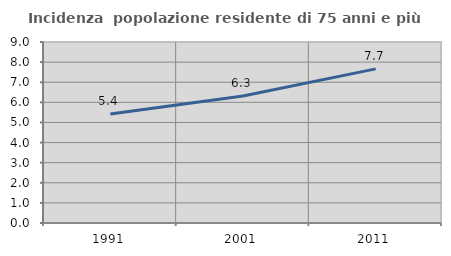
| Category | Incidenza  popolazione residente di 75 anni e più |
|---|---|
| 1991.0 | 5.419 |
| 2001.0 | 6.318 |
| 2011.0 | 7.665 |